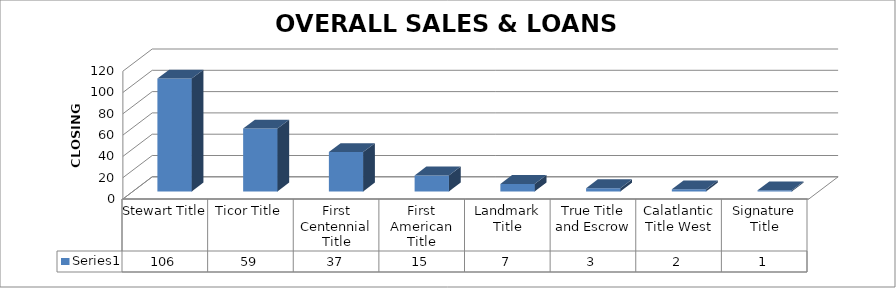
| Category | Series 0 |
|---|---|
| Stewart Title | 106 |
| Ticor Title | 59 |
| First Centennial Title | 37 |
| First American Title | 15 |
| Landmark Title | 7 |
| True Title and Escrow | 3 |
| Calatlantic Title West | 2 |
| Signature Title | 1 |